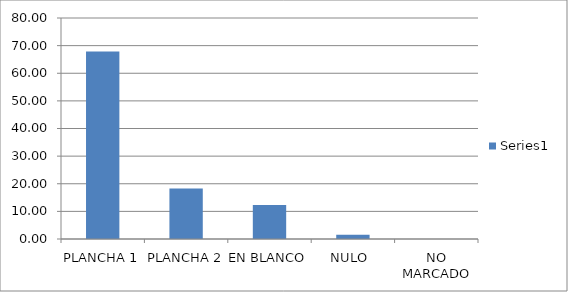
| Category | Series 0 |
|---|---|
| PLANCHA 1 | 67.868 |
| PLANCHA 2 | 18.318 |
| EN BLANCO | 12.312 |
| NULO  | 1.502 |
| NO MARCADO | 0 |